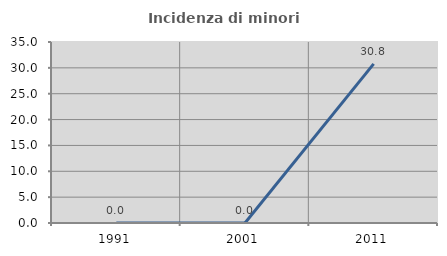
| Category | Incidenza di minori stranieri |
|---|---|
| 1991.0 | 0 |
| 2001.0 | 0 |
| 2011.0 | 30.769 |